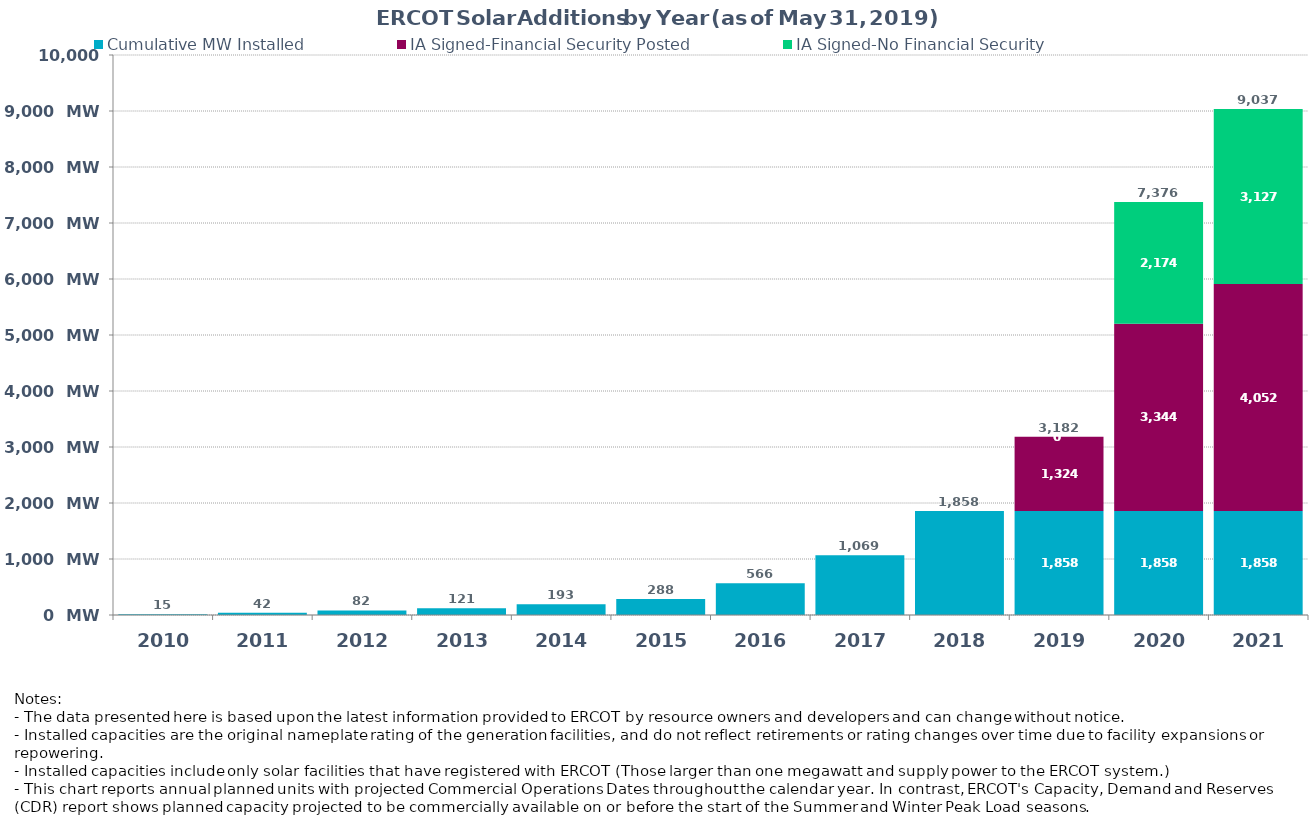
| Category | Cumulative MW Installed | IA Signed-Financial Security Posted  | IA Signed-No Financial Security  | Cumulative Installed and Planned |
|---|---|---|---|---|
| 2010.0 | 15 | 0 | 0 | 15 |
| 2011.0 | 42 | 0 | 0 | 42 |
| 2012.0 | 82 | 0 | 0 | 82 |
| 2013.0 | 121 | 0 | 0 | 121 |
| 2014.0 | 193 | 0 | 0 | 193 |
| 2015.0 | 287.7 | 0 | 0 | 287.7 |
| 2016.0 | 566.4 | 0 | 0 | 566.4 |
| 2017.0 | 1068.7 | 0 | 0 | 1068.7 |
| 2018.0 | 1857.7 | 0 | 0 | 1857.7 |
| 2019.0 | 1857.68 | 1324.4 | 0 | 3182.08 |
| 2020.0 | 1857.68 | 3344.43 | 2174 | 7376.11 |
| 2021.0 | 1857.68 | 4051.68 | 3127.3 | 9036.66 |